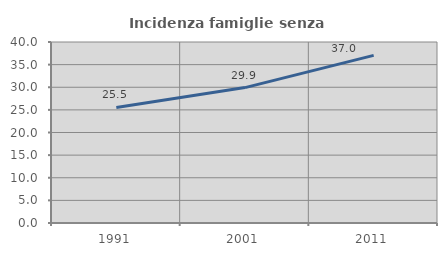
| Category | Incidenza famiglie senza nuclei |
|---|---|
| 1991.0 | 25.527 |
| 2001.0 | 29.924 |
| 2011.0 | 37.038 |